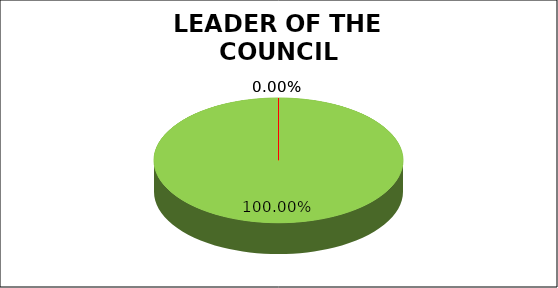
| Category | Q1 |
|---|---|
| Green | 1 |
| Amber | 0 |
| Red | 0 |